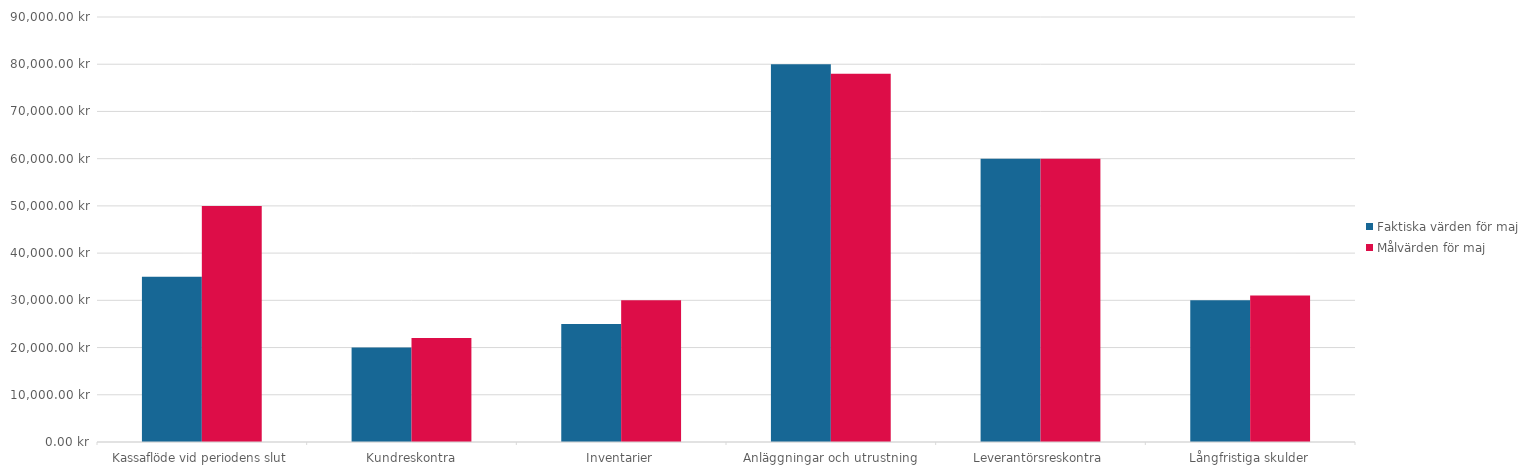
| Category | Faktiska värden för maj | Målvärden för maj |
|---|---|---|
| Kassaflöde vid periodens slut | 35000 | 50000 |
| Kundreskontra | 20000 | 22000 |
| Inventarier | 25000 | 30000 |
| Anläggningar och utrustning | 80000 | 78000 |
| Leverantörsreskontra | 60000 | 60000 |
| Långfristiga skulder | 30000 | 31000 |